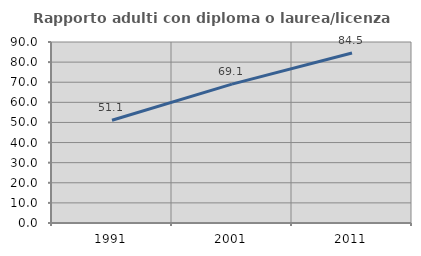
| Category | Rapporto adulti con diploma o laurea/licenza media  |
|---|---|
| 1991.0 | 51.095 |
| 2001.0 | 69.054 |
| 2011.0 | 84.543 |